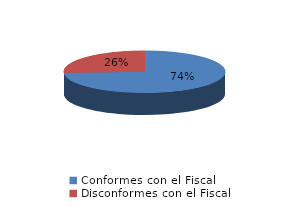
| Category | Series 0 |
|---|---|
| 0 | 581 |
| 1 | 203 |